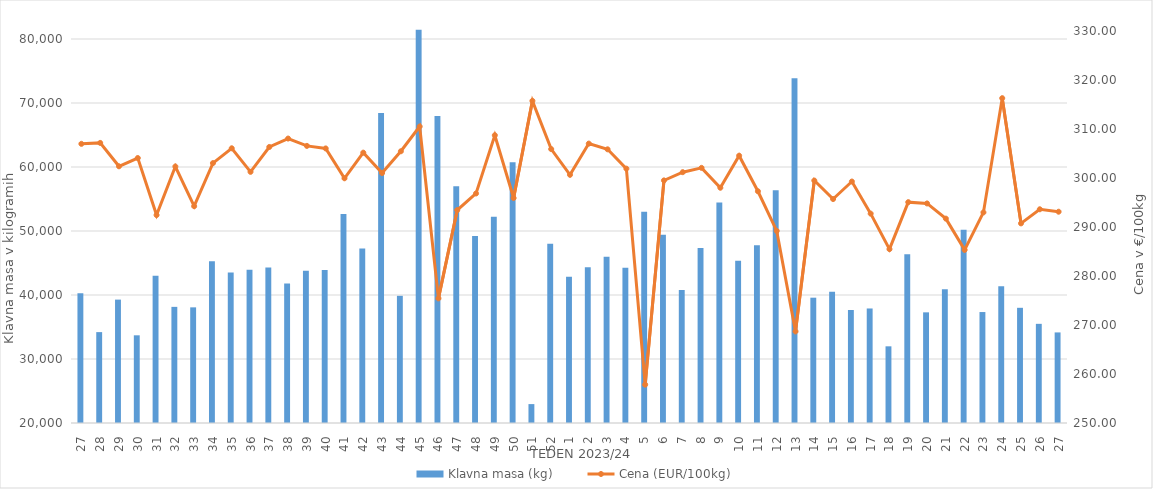
| Category | Klavna masa (kg) |
|---|---|
| 27.0 | 40280 |
| 28.0 | 34201 |
| 29.0 | 39279 |
| 30.0 | 33702 |
| 31.0 | 43020 |
| 32.0 | 38146 |
| 33.0 | 38070 |
| 34.0 | 45290 |
| 35.0 | 43513 |
| 36.0 | 43945 |
| 37.0 | 44302 |
| 38.0 | 41798 |
| 39.0 | 43790 |
| 40.0 | 43913 |
| 41.0 | 52663 |
| 42.0 | 47275 |
| 43.0 | 68419 |
| 44.0 | 39872 |
| 45.0 | 81439 |
| 46.0 | 67983 |
| 47.0 | 57006 |
| 48.0 | 49204 |
| 49.0 | 52219 |
| 50.0 | 60759 |
| 51.0 | 22954 |
| 52.0 | 48002 |
| 1.0 | 42866 |
| 2.0 | 44318 |
| 3.0 | 45969 |
| 4.0 | 44266 |
| 5.0 | 52991 |
| 6.0 | 49406 |
| 7.0 | 40769 |
| 8.0 | 47349 |
| 9.0 | 54448 |
| 10.0 | 45343 |
| 11.0 | 47770 |
| 12.0 | 56370 |
| 13.0 | 73886 |
| 14.0 | 39581 |
| 15.0 | 40490 |
| 16.0 | 37654 |
| 17.0 | 37894 |
| 18.0 | 31981 |
| 19.0 | 46375 |
| 20.0 | 37290 |
| 21.0 | 40893 |
| 22.0 | 50178 |
| 23.0 | 37338 |
| 24.0 | 41348 |
| 25.0 | 37999 |
| 26.0 | 35494 |
| 27.0 | 34153 |